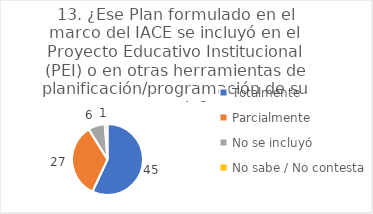
| Category | 13. ¿Ese Plan formulado en el marco del IACE se incluyó en el Proyecto Educativo Institucional (PEI) o en otras herramientas de planificación/programación de su escuela? |
|---|---|
| Totalmente  | 0.57 |
| Parcialmente  | 0.342 |
| No se incluyó  | 0.076 |
| No sabe / No contesta | 0.013 |